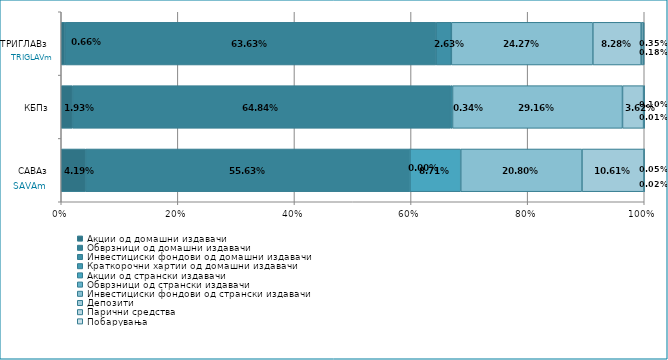
| Category | Акции од домашни издавачи  | Обврзници од домашни издавачи  | Инвестициски фондови од домашни издавачи  | Краткорочни хартии од домашни издавачи  | Акции од странски издавачи  | Обврзници од странски издавачи  | Инвестициски фондови од странски издавaчи | Депозити  | Парични средства  | Побарувања |
|---|---|---|---|---|---|---|---|---|---|---|
| САВАз | 0.042 | 0.556 | 0 | 0 | 0.087 | 0 | 0.208 | 0.106 | 0 | 0 |
| КБПз | 0.019 | 0.648 | 0.003 | 0 | 0 | 0 | 0.292 | 0.036 | 0.001 | 0 |
| ТРИГЛАВз | 0.007 | 0.636 | 0.026 | 0 | 0 | 0 | 0.243 | 0.083 | 0.003 | 0.002 |